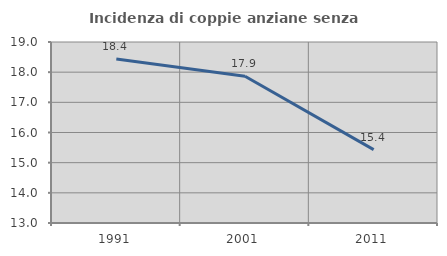
| Category | Incidenza di coppie anziane senza figli  |
|---|---|
| 1991.0 | 18.437 |
| 2001.0 | 17.864 |
| 2011.0 | 15.433 |